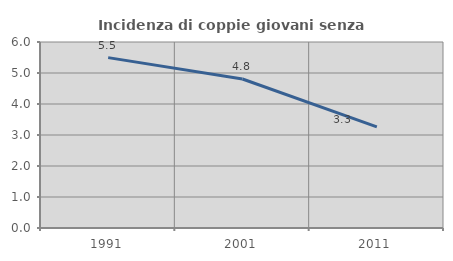
| Category | Incidenza di coppie giovani senza figli |
|---|---|
| 1991.0 | 5.496 |
| 2001.0 | 4.806 |
| 2011.0 | 3.263 |